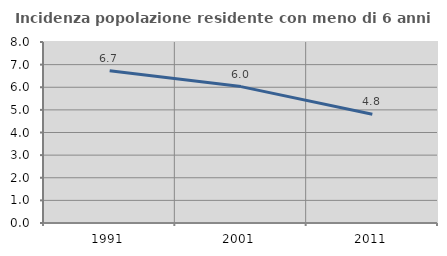
| Category | Incidenza popolazione residente con meno di 6 anni |
|---|---|
| 1991.0 | 6.733 |
| 2001.0 | 6.029 |
| 2011.0 | 4.803 |